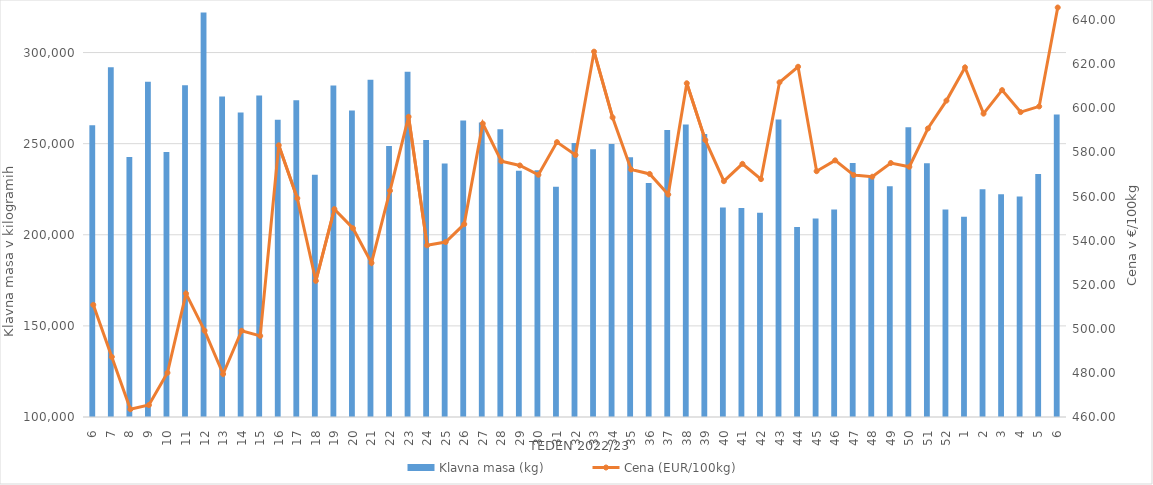
| Category | Klavna masa (kg) |
|---|---|
| 6.0 | 260108 |
| 7.0 | 291887 |
| 8.0 | 242732 |
| 9.0 | 283987 |
| 10.0 | 245414 |
| 11.0 | 282092 |
| 12.0 | 321936 |
| 13.0 | 275950 |
| 14.0 | 267148 |
| 15.0 | 276417 |
| 16.0 | 263098 |
| 17.0 | 273824 |
| 18.0 | 232926 |
| 19.0 | 281859 |
| 20.0 | 268153 |
| 21.0 | 285073 |
| 22.0 | 248783 |
| 23.0 | 289478 |
| 24.0 | 252069 |
| 25.0 | 239099 |
| 26.0 | 262689 |
| 27.0 | 261656 |
| 28.0 | 257905 |
| 29.0 | 235185 |
| 30.0 | 235475 |
| 31.0 | 226322 |
| 32.0 | 250418 |
| 33.0 | 246996 |
| 34.0 | 249873 |
| 35.0 | 242516 |
| 36.0 | 228469 |
| 37.0 | 257511 |
| 38.0 | 260481 |
| 39.0 | 255370 |
| 40.0 | 214936 |
| 41.0 | 214672 |
| 42.0 | 212066 |
| 43.0 | 263287 |
| 44.0 | 204280 |
| 45.0 | 208920 |
| 46.0 | 213836 |
| 47.0 | 239417 |
| 48.0 | 231565 |
| 49.0 | 226575 |
| 50.0 | 259073 |
| 51.0 | 239211 |
| 52.0 | 213841 |
| 1.0 | 209877 |
| 2.0 | 225045 |
| 3.0 | 222198 |
| 4.0 | 221002 |
| 5.0 | 233306 |
| 6.0 | 265944 |